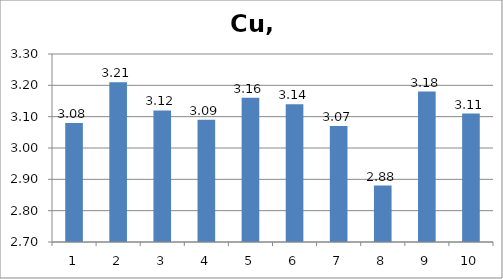
| Category | Cu, mg/l |
|---|---|
| 0 | 3.08 |
| 1 | 3.21 |
| 2 | 3.12 |
| 3 | 3.09 |
| 4 | 3.16 |
| 5 | 3.14 |
| 6 | 3.07 |
| 7 | 2.88 |
| 8 | 3.18 |
| 9 | 3.11 |